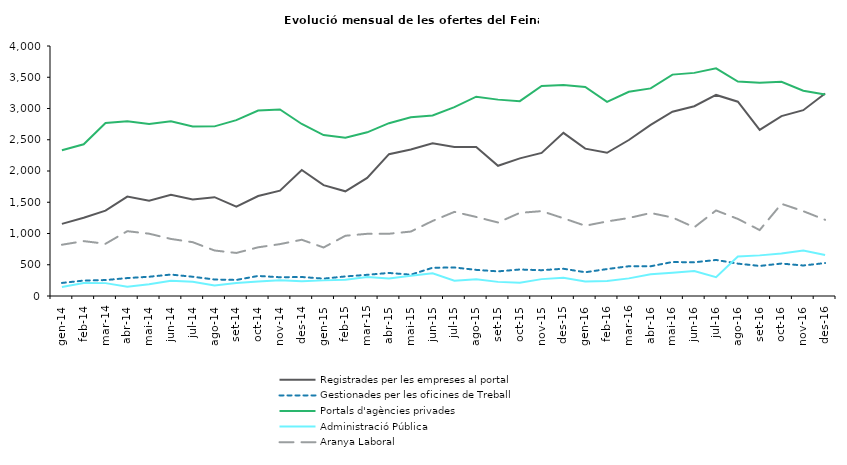
| Category | Registrades per les empreses al portal | Gestionades per les oficines de Treball | Portals d'agències privades | Administració Pública | Aranya Laboral |
|---|---|---|---|---|---|
| gen-14 | 1154 | 209 | 2331 | 144 | 820 |
| feb-14 | 1251 | 247 | 2427 | 209 | 878 |
| mar-14 | 1366 | 255 | 2767 | 206 | 836 |
| abr-14 | 1591 | 287 | 2794 | 148 | 1037 |
| mai-14 | 1523 | 308 | 2754 | 187 | 997 |
| jun-14 | 1619 | 343 | 2794 | 242 | 913 |
| jul-14 | 1544 | 308 | 2713 | 228 | 861 |
| ago-14 | 1581 | 264 | 2714 | 170 | 728 |
| set-14 | 1431 | 257 | 2814 | 208 | 689 |
| oct-14 | 1600 | 321 | 2967 | 232 | 779 |
| nov-14 | 1686 | 300 | 2984 | 253 | 830 |
| des-14 | 2017 | 304 | 2752 | 238 | 900 |
| gen-15 | 1774 | 278 | 2575 | 250 | 776 |
| feb-15 | 1675 | 313 | 2534 | 261 | 964 |
| mar-15 | 1889 | 339 | 2619 | 304 | 995 |
| abr-15 | 2269 | 369 | 2765 | 280 | 996 |
| mai-15 | 2345 | 341 | 2860 | 325 | 1031 |
| jun-15 | 2444 | 452 | 2889 | 362 | 1201 |
| jul-15 | 2383 | 456 | 3023 | 243 | 1346 |
| ago-15 | 2385 | 418 | 3189 | 267 | 1265 |
| set-15 | 2083 | 394 | 3142 | 226 | 1176 |
| oct-15 | 2202 | 424 | 3118 | 213 | 1330 |
| nov-15 | 2289 | 413 | 3361 | 270 | 1358 |
| des-15 | 2610 | 436 | 3375 | 290 | 1244 |
| gen-16 | 2358 | 380 | 3344 | 232 | 1124 |
| feb-16 | 2291 | 431 | 3106 | 240 | 1193 |
| mar-16 | 2496 | 476 | 3268 | 282 | 1248 |
| abr-16 | 2738 | 476 | 3322 | 349 | 1328 |
| mai-16 | 2949 | 544 | 3542 | 373 | 1256 |
| jun-16 | 3037 | 539 | 3570 | 399 | 1099 |
| jul-16 | 3217 | 577 | 3643 | 300 | 1369 |
| ago-16 | 3109 | 518 | 3431 | 632 | 1233 |
| set-16 | 2658 | 481 | 3414 | 650 | 1055 |
| oct-16 | 2878 | 519 | 3426 | 680 | 1475 |
| nov-16 | 2973 | 488 | 3285 | 726 | 1357 |
| des-16 | 3241 | 527 | 3225 | 656 | 1219 |